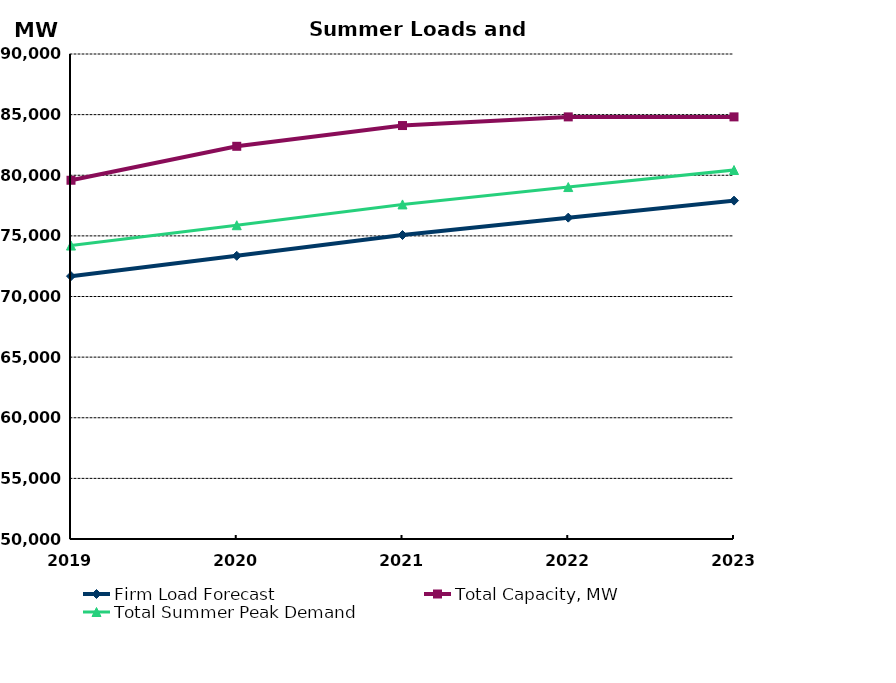
| Category | Firm Load Forecast | Total Capacity, MW | Total Summer Peak Demand |
|---|---|---|---|
| 2019.0 | 71678.616 | 79587.205 | 74201.984 |
| 2020.0 | 73355.223 | 82387.324 | 75878.591 |
| 2021.0 | 75071.684 | 84099.844 | 77595.052 |
| 2022.0 | 76503.4 | 84813.844 | 79026.768 |
| 2023.0 | 77907.184 | 84813.844 | 80430.551 |